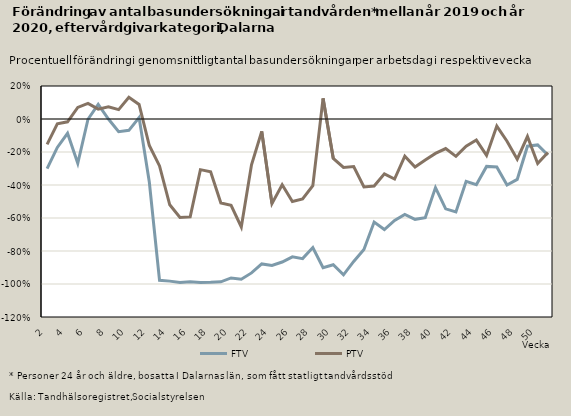
| Category | FTV | PTV |
|---|---|---|
| 2.0 | -0.3 | -0.153 |
| 3.0 | -0.172 | -0.029 |
| 4.0 | -0.086 | -0.017 |
| 5.0 | -0.268 | 0.07 |
| 6.0 | -0.002 | 0.095 |
| 7.0 | 0.089 | 0.06 |
| 8.0 | 0 | 0.074 |
| 9.0 | -0.077 | 0.057 |
| 10.0 | -0.069 | 0.132 |
| 11.0 | 0.009 | 0.088 |
| 12.0 | -0.382 | -0.161 |
| 13.0 | -0.978 | -0.285 |
| 14.0 | -0.983 | -0.52 |
| 15.0 | -0.991 | -0.596 |
| 16.0 | -0.986 | -0.593 |
| 17.0 | -0.991 | -0.307 |
| 18.0 | -0.99 | -0.32 |
| 19.0 | -0.987 | -0.509 |
| 20.0 | -0.963 | -0.523 |
| 21.0 | -0.971 | -0.655 |
| 22.0 | -0.933 | -0.278 |
| 23.0 | -0.878 | -0.075 |
| 24.0 | -0.887 | -0.513 |
| 25.0 | -0.867 | -0.398 |
| 26.0 | -0.835 | -0.5 |
| 27.0 | -0.846 | -0.485 |
| 28.0 | -0.779 | -0.404 |
| 29.0 | -0.902 | 0.125 |
| 30.0 | -0.883 | -0.239 |
| 31.0 | -0.944 | -0.293 |
| 32.0 | -0.863 | -0.289 |
| 33.0 | -0.791 | -0.412 |
| 34.0 | -0.625 | -0.406 |
| 35.0 | -0.67 | -0.332 |
| 36.0 | -0.615 | -0.364 |
| 37.0 | -0.579 | -0.225 |
| 38.0 | -0.608 | -0.291 |
| 39.0 | -0.598 | -0.248 |
| 40.0 | -0.416 | -0.208 |
| 41.0 | -0.545 | -0.179 |
| 42.0 | -0.563 | -0.226 |
| 43.0 | -0.378 | -0.165 |
| 44.0 | -0.398 | -0.128 |
| 45.0 | -0.287 | -0.221 |
| 46.0 | -0.291 | -0.043 |
| 47.0 | -0.4 | -0.134 |
| 48.0 | -0.366 | -0.243 |
| 49.0 | -0.165 | -0.106 |
| 50.0 | -0.157 | -0.27 |
| 51.0 | -0.218 | -0.203 |